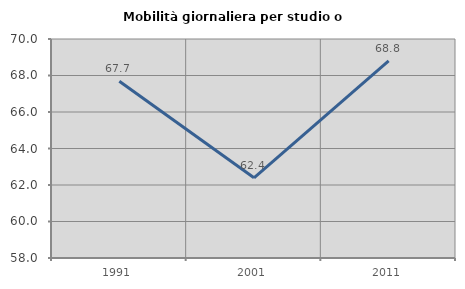
| Category | Mobilità giornaliera per studio o lavoro |
|---|---|
| 1991.0 | 67.69 |
| 2001.0 | 62.392 |
| 2011.0 | 68.806 |